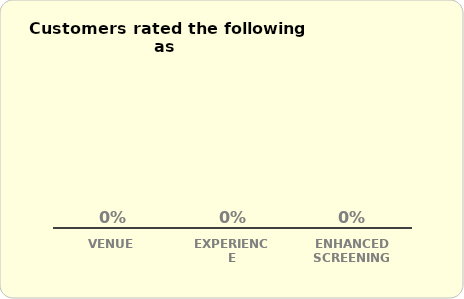
| Category | Series 0 |
|---|---|
| VENUE | 0 |
| EXPERIENCE | 0 |
| ENHANCED SCREENING | 0 |